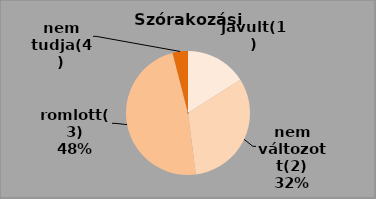
| Category | Series 0 | Series 1 |
|---|---|---|
| javult(1) | 4 | 16 |
| nem változott(2) | 8 | 32 |
| romlott(3) | 12 | 48 |
| nem tudja(4) | 1 | 4 |